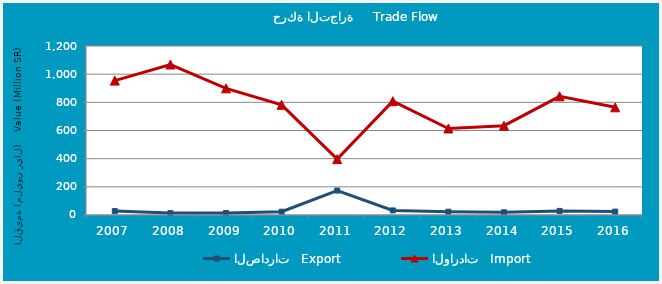
| Category | الصادرات   Export | الواردات   Import |
|---|---|---|
| 2007.0 | 27.677 | 954.458 |
| 2008.0 | 13.692 | 1068.63 |
| 2009.0 | 14.447 | 899.166 |
| 2010.0 | 23.402 | 782.271 |
| 2011.0 | 173.407 | 396.561 |
| 2012.0 | 32.675 | 808.246 |
| 2013.0 | 23.381 | 614.371 |
| 2014.0 | 19.238 | 634.163 |
| 2015.0 | 29.124 | 842.68 |
| 2016.0 | 24.026 | 764.554 |